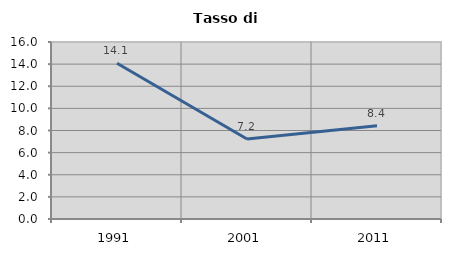
| Category | Tasso di disoccupazione   |
|---|---|
| 1991.0 | 14.085 |
| 2001.0 | 7.226 |
| 2011.0 | 8.427 |